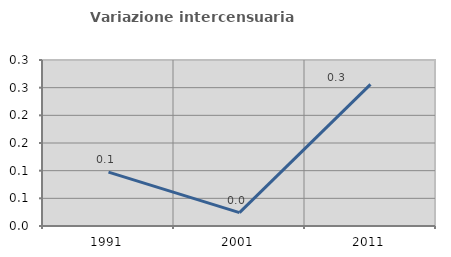
| Category | Variazione intercensuaria annua |
|---|---|
| 1991.0 | 0.097 |
| 2001.0 | 0.024 |
| 2011.0 | 0.256 |